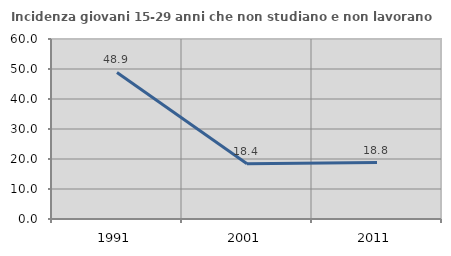
| Category | Incidenza giovani 15-29 anni che non studiano e non lavorano  |
|---|---|
| 1991.0 | 48.859 |
| 2001.0 | 18.432 |
| 2011.0 | 18.8 |